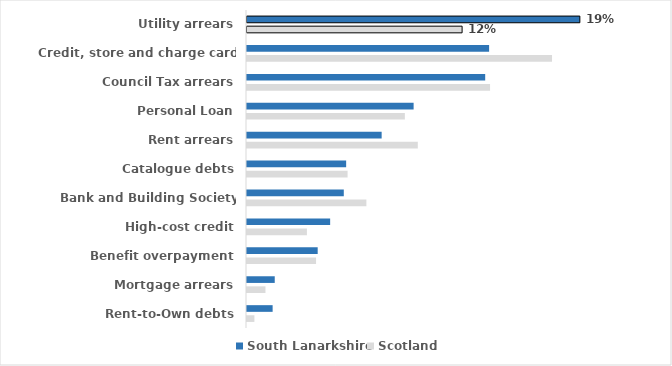
| Category | South Lanarkshire | Scotland |
|---|---|---|
| Utility arrears | 0.192 | 0.124 |
| Credit, store and charge card debts | 0.14 | 0.176 |
| Council Tax arrears | 0.137 | 0.14 |
| Personal Loan | 0.096 | 0.091 |
| Rent arrears | 0.078 | 0.099 |
| Catalogue debts | 0.057 | 0.058 |
| Bank and Building Society overdrafts | 0.056 | 0.069 |
| High-cost credit | 0.048 | 0.035 |
| Benefit overpayment | 0.041 | 0.04 |
| Mortgage arrears | 0.016 | 0.011 |
| Rent-to-Own debts | 0.015 | 0.004 |